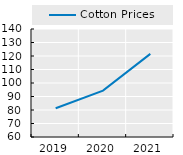
| Category | Cotton Prices |
|---|---|
| 2019.0 | 81.274 |
| 2020.0 | 94.332 |
| 2021.0 | 121.556 |